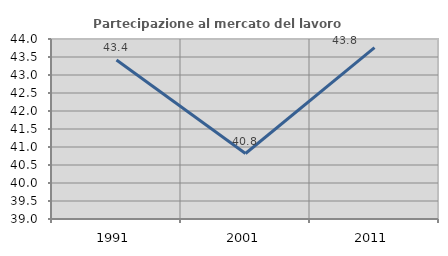
| Category | Partecipazione al mercato del lavoro  femminile |
|---|---|
| 1991.0 | 43.417 |
| 2001.0 | 40.819 |
| 2011.0 | 43.76 |